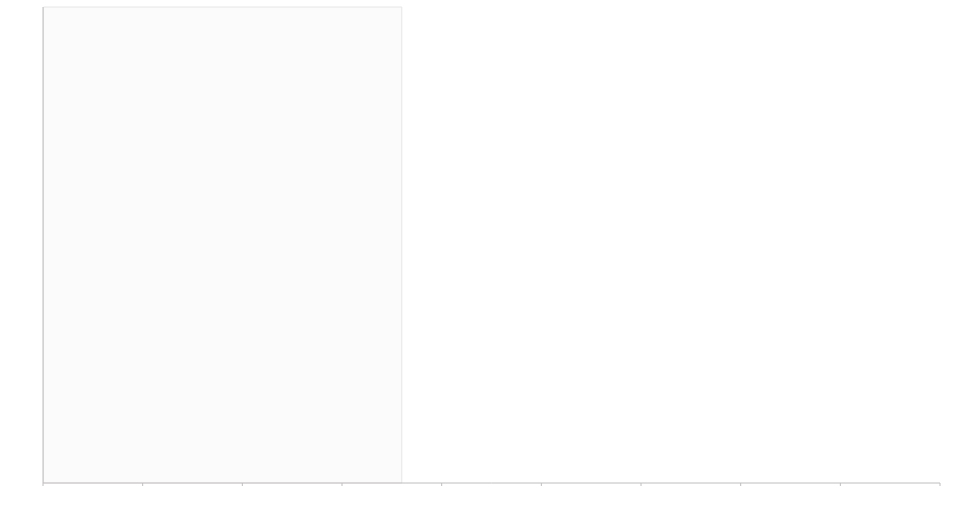
| Category | Series 1 | Series 0 |
|---|---|---|
| 0 | 0.36 | 0.54 |